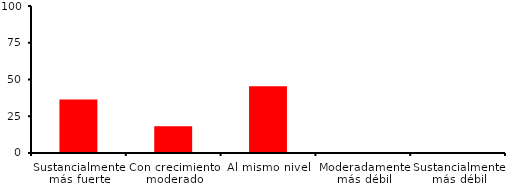
| Category | Series 0 |
|---|---|
| Sustancialmente más fuerte | 36.364 |
| Con crecimiento moderado | 18.182 |
| Al mismo nivel | 45.455 |
| Moderadamente más débil | 0 |
| Sustancialmente más débil | 0 |